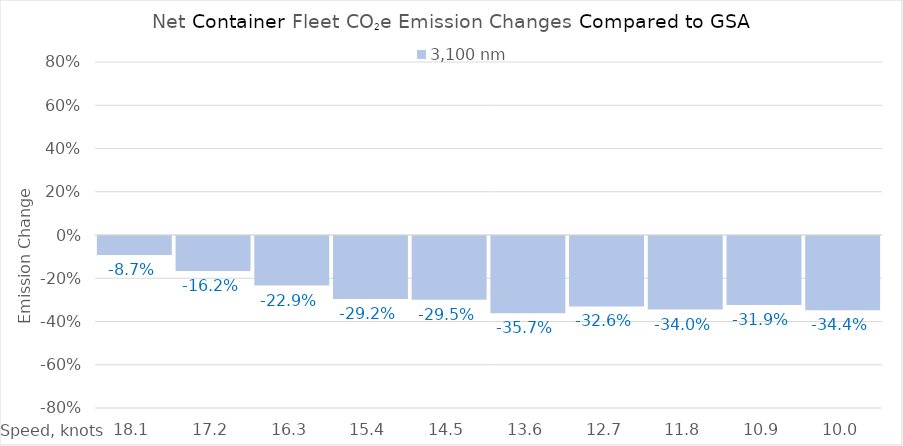
| Category | 3,100 |
|---|---|
| 18.1 | -0.087 |
| 17.200000000000003 | -0.162 |
| 16.300000000000004 | -0.229 |
| 15.400000000000004 | -0.292 |
| 14.500000000000004 | -0.295 |
| 13.600000000000003 | -0.357 |
| 12.700000000000003 | -0.326 |
| 11.800000000000002 | -0.34 |
| 10.900000000000002 | -0.319 |
| 10.000000000000002 | -0.344 |